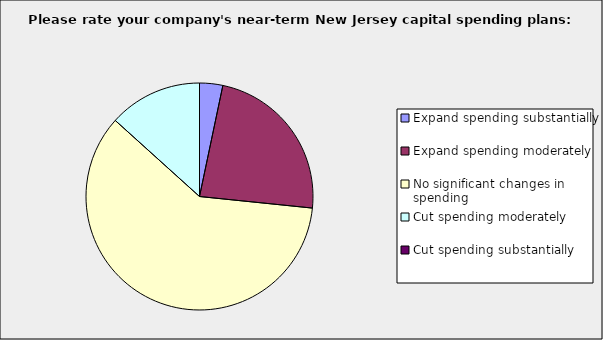
| Category | Series 0 |
|---|---|
| Expand spending substantially | 0.033 |
| Expand spending moderately | 0.233 |
| No significant changes in spending | 0.6 |
| Cut spending moderately | 0.133 |
| Cut spending substantially | 0 |